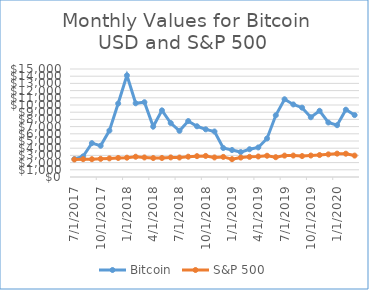
| Category | Bitcoin | S&P 500 |
|---|---|---|
| 7/1/17 | 2492.6 | 2431.39 |
| 8/1/17 | 2871.3 | 2477.1 |
| 9/1/17 | 4701.76 | 2474.42 |
| 10/1/17 | 4341.05 | 2521.2 |
| 11/1/17 | 6440.97 | 2583.21 |
| 12/1/17 | 10198.6 | 2645.1 |
| 1/1/18 | 14112.2 | 2683.73 |
| 2/1/18 | 10237.3 | 2816.45 |
| 3/1/18 | 10385 | 2715.22 |
| 4/1/18 | 7003.06 | 2633.45 |
| 5/1/18 | 9251.47 | 2642.96 |
| 6/1/18 | 7500.7 | 2718.7 |
| 7/1/18 | 6411.68 | 2704.95 |
| 8/1/18 | 7769.04 | 2821.17 |
| 9/1/18 | 7044.81 | 2896.96 |
| 10/1/18 | 6619.85 | 2926.29 |
| 11/1/18 | 6318.14 | 2717.58 |
| 12/1/18 | 4024.464 | 2790.5 |
| 1/1/19 | 3746.713 | 2476.96 |
| 2/1/19 | 3460.547 | 2702.32 |
| 3/1/19 | 3853.757 | 2798.22 |
| 4/1/19 | 4105.362 | 2848.63 |
| 5/1/19 | 5350.915 | 2952.33 |
| 6/1/19 | 8573.84 | 2751.53 |
| 7/1/19 | 10796.931 | 2971.41 |
| 8/1/19 | 10077.442 | 2980.32 |
| 9/1/19 | 9630.593 | 2909.01 |
| 10/1/19 | 8299.721 | 2983.69 |
| 11/1/19 | 9193.992 | 3050.72 |
| 12/1/19 | 7571.616 | 3143.85 |
| 1/1/20 | 7194.892 | 3244.67 |
| 2/1/20 | 9346.357 | 3235.66 |
| 3/1/20 | 8599.759 | 2974.28 |